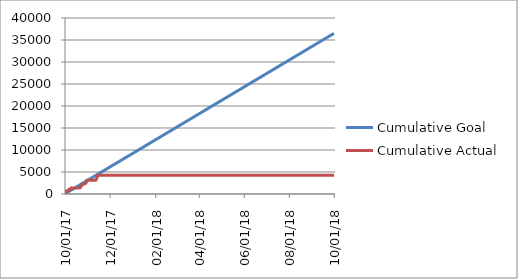
| Category | Cumulative |
|---|---|
| 2017-10-01 | 0 |
| 2017-10-02 | 685 |
| 2017-10-03 | 685 |
| 2017-10-04 | 685 |
| 2017-10-05 | 685 |
| 2017-10-06 | 1061 |
| 2017-10-07 | 1061 |
| 2017-10-08 | 1061 |
| 2017-10-09 | 1392 |
| 2017-10-10 | 1392 |
| 2017-10-11 | 1392 |
| 2017-10-12 | 1392 |
| 2017-10-13 | 1392 |
| 2017-10-14 | 1392 |
| 2017-10-15 | 1392 |
| 2017-10-16 | 1392 |
| 2017-10-17 | 1392 |
| 2017-10-18 | 1392 |
| 2017-10-19 | 1392 |
| 2017-10-20 | 1412 |
| 2017-10-21 | 1412 |
| 2017-10-22 | 1412 |
| 2017-10-23 | 1857 |
| 2017-10-24 | 1857 |
| 2017-10-25 | 2286 |
| 2017-10-26 | 2286 |
| 2017-10-27 | 2286 |
| 2017-10-28 | 2479 |
| 2017-10-29 | 2479 |
| 2017-10-30 | 3119 |
| 2017-10-31 | 3119 |
| 2017-11-01 | 3119 |
| 2017-11-02 | 3119 |
| 2017-11-03 | 3119 |
| 2017-11-04 | 3119 |
| 2017-11-05 | 3119 |
| 2017-11-06 | 3119 |
| 2017-11-07 | 3119 |
| 2017-11-08 | 3119 |
| 2017-11-09 | 3119 |
| 2017-11-10 | 3119 |
| 2017-11-11 | 3119 |
| 2017-11-12 | 3119 |
| 2017-11-13 | 3718 |
| 2017-11-14 | 4267 |
| 2017-11-15 | 4267 |
| 2017-11-16 | 4267 |
| 2017-11-17 | 4267 |
| 2017-11-18 | 4267 |
| 2017-11-19 | 4267 |
| 2017-11-20 | 4267 |
| 2017-11-21 | 4267 |
| 2017-11-22 | 4267 |
| 2017-11-23 | 4267 |
| 2017-11-24 | 4267 |
| 2017-11-25 | 4267 |
| 2017-11-26 | 4267 |
| 2017-11-27 | 4267 |
| 2017-11-28 | 4267 |
| 2017-11-29 | 4267 |
| 2017-11-30 | 4267 |
| 2017-12-01 | 4267 |
| 2017-12-02 | 4267 |
| 2017-12-03 | 4267 |
| 2017-12-04 | 4267 |
| 2017-12-05 | 4267 |
| 2017-12-06 | 4267 |
| 2017-12-07 | 4267 |
| 2017-12-08 | 4267 |
| 2017-12-09 | 4267 |
| 2017-12-10 | 4267 |
| 2017-12-11 | 4267 |
| 2017-12-12 | 4267 |
| 2017-12-13 | 4267 |
| 2017-12-14 | 4267 |
| 2017-12-15 | 4267 |
| 2017-12-16 | 4267 |
| 2017-12-17 | 4267 |
| 2017-12-18 | 4267 |
| 2017-12-19 | 4267 |
| 2017-12-20 | 4267 |
| 2017-12-21 | 4267 |
| 2017-12-22 | 4267 |
| 2017-12-23 | 4267 |
| 2017-12-24 | 4267 |
| 2017-12-25 | 4267 |
| 2017-12-26 | 4267 |
| 2017-12-27 | 4267 |
| 2017-12-28 | 4267 |
| 2017-12-29 | 4267 |
| 2017-12-30 | 4267 |
| 2017-12-31 | 4267 |
| 2018-01-01 | 4267 |
| 2018-01-02 | 4267 |
| 2018-01-03 | 4267 |
| 2018-01-04 | 4267 |
| 2018-01-05 | 4267 |
| 2018-01-06 | 4267 |
| 2018-01-07 | 4267 |
| 2018-01-08 | 4267 |
| 2018-01-09 | 4267 |
| 2018-01-10 | 4267 |
| 2018-01-11 | 4267 |
| 2018-01-12 | 4267 |
| 2018-01-13 | 4267 |
| 2018-01-14 | 4267 |
| 2018-01-15 | 4267 |
| 2018-01-16 | 4267 |
| 2018-01-17 | 4267 |
| 2018-01-18 | 4267 |
| 2018-01-19 | 4267 |
| 2018-01-20 | 4267 |
| 2018-01-21 | 4267 |
| 2018-01-22 | 4267 |
| 2018-01-23 | 4267 |
| 2018-01-24 | 4267 |
| 2018-01-25 | 4267 |
| 2018-01-26 | 4267 |
| 2018-01-27 | 4267 |
| 2018-01-28 | 4267 |
| 2018-01-29 | 4267 |
| 2018-01-30 | 4267 |
| 2018-01-31 | 4267 |
| 2018-02-01 | 4267 |
| 2018-02-02 | 4267 |
| 2018-02-03 | 4267 |
| 2018-02-04 | 4267 |
| 2018-02-05 | 4267 |
| 2018-02-06 | 4267 |
| 2018-02-07 | 4267 |
| 2018-02-08 | 4267 |
| 2018-02-09 | 4267 |
| 2018-02-10 | 4267 |
| 2018-02-11 | 4267 |
| 2018-02-12 | 4267 |
| 2018-02-13 | 4267 |
| 2018-02-14 | 4267 |
| 2018-02-15 | 4267 |
| 2018-02-16 | 4267 |
| 2018-02-17 | 4267 |
| 2018-02-18 | 4267 |
| 2018-02-19 | 4267 |
| 2018-02-20 | 4267 |
| 2018-02-21 | 4267 |
| 2018-02-22 | 4267 |
| 2018-02-23 | 4267 |
| 2018-02-24 | 4267 |
| 2018-02-25 | 4267 |
| 2018-02-26 | 4267 |
| 2018-02-27 | 4267 |
| 2018-02-28 | 4267 |
| 2018-03-01 | 4267 |
| 2018-03-02 | 4267 |
| 2018-03-03 | 4267 |
| 2018-03-04 | 4267 |
| 2018-03-05 | 4267 |
| 2018-03-06 | 4267 |
| 2018-03-07 | 4267 |
| 2018-03-08 | 4267 |
| 2018-03-09 | 4267 |
| 2018-03-10 | 4267 |
| 2018-03-11 | 4267 |
| 2018-03-12 | 4267 |
| 2018-03-13 | 4267 |
| 2018-03-14 | 4267 |
| 2018-03-15 | 4267 |
| 2018-03-16 | 4267 |
| 2018-03-17 | 4267 |
| 2018-03-18 | 4267 |
| 2018-03-19 | 4267 |
| 2018-03-20 | 4267 |
| 2018-03-21 | 4267 |
| 2018-03-22 | 4267 |
| 2018-03-23 | 4267 |
| 2018-03-24 | 4267 |
| 2018-03-25 | 4267 |
| 2018-03-26 | 4267 |
| 2018-03-27 | 4267 |
| 2018-03-28 | 4267 |
| 2018-03-29 | 4267 |
| 2018-03-30 | 4267 |
| 2018-03-31 | 4267 |
| 2018-04-01 | 4267 |
| 2018-04-02 | 4267 |
| 2018-04-03 | 4267 |
| 2018-04-04 | 4267 |
| 2018-04-05 | 4267 |
| 2018-04-06 | 4267 |
| 2018-04-07 | 4267 |
| 2018-04-08 | 4267 |
| 2018-04-09 | 4267 |
| 2018-04-10 | 4267 |
| 2018-04-11 | 4267 |
| 2018-04-12 | 4267 |
| 2018-04-13 | 4267 |
| 2018-04-14 | 4267 |
| 2018-04-15 | 4267 |
| 2018-04-16 | 4267 |
| 2018-04-17 | 4267 |
| 2018-04-18 | 4267 |
| 2018-04-19 | 4267 |
| 2018-04-20 | 4267 |
| 2018-04-21 | 4267 |
| 2018-04-22 | 4267 |
| 2018-04-23 | 4267 |
| 2018-04-24 | 4267 |
| 2018-04-25 | 4267 |
| 2018-04-26 | 4267 |
| 2018-04-27 | 4267 |
| 2018-04-28 | 4267 |
| 2018-04-29 | 4267 |
| 2018-04-30 | 4267 |
| 2018-05-01 | 4267 |
| 2018-05-02 | 4267 |
| 2018-05-03 | 4267 |
| 2018-05-04 | 4267 |
| 2018-05-05 | 4267 |
| 2018-05-06 | 4267 |
| 2018-05-07 | 4267 |
| 2018-05-08 | 4267 |
| 2018-05-09 | 4267 |
| 2018-05-10 | 4267 |
| 2018-05-11 | 4267 |
| 2018-05-12 | 4267 |
| 2018-05-13 | 4267 |
| 2018-05-14 | 4267 |
| 2018-05-15 | 4267 |
| 2018-05-16 | 4267 |
| 2018-05-17 | 4267 |
| 2018-05-18 | 4267 |
| 2018-05-19 | 4267 |
| 2018-05-20 | 4267 |
| 2018-05-21 | 4267 |
| 2018-05-22 | 4267 |
| 2018-05-23 | 4267 |
| 2018-05-24 | 4267 |
| 2018-05-25 | 4267 |
| 2018-05-26 | 4267 |
| 2018-05-27 | 4267 |
| 2018-05-28 | 4267 |
| 2018-05-29 | 4267 |
| 2018-05-30 | 4267 |
| 2018-05-31 | 4267 |
| 2018-06-01 | 4267 |
| 2018-06-02 | 4267 |
| 2018-06-03 | 4267 |
| 2018-06-04 | 4267 |
| 2018-06-05 | 4267 |
| 2018-06-06 | 4267 |
| 2018-06-07 | 4267 |
| 2018-06-08 | 4267 |
| 2018-06-09 | 4267 |
| 2018-06-10 | 4267 |
| 2018-06-11 | 4267 |
| 2018-06-12 | 4267 |
| 2018-06-13 | 4267 |
| 2018-06-14 | 4267 |
| 2018-06-15 | 4267 |
| 2018-06-16 | 4267 |
| 2018-06-17 | 4267 |
| 2018-06-18 | 4267 |
| 2018-06-19 | 4267 |
| 2018-06-20 | 4267 |
| 2018-06-21 | 4267 |
| 2018-06-22 | 4267 |
| 2018-06-23 | 4267 |
| 2018-06-24 | 4267 |
| 2018-06-25 | 4267 |
| 2018-06-26 | 4267 |
| 2018-06-27 | 4267 |
| 2018-06-28 | 4267 |
| 2018-06-29 | 4267 |
| 2018-06-30 | 4267 |
| 2018-07-01 | 4267 |
| 2018-07-02 | 4267 |
| 2018-07-03 | 4267 |
| 2018-07-04 | 4267 |
| 2018-07-05 | 4267 |
| 2018-07-06 | 4267 |
| 2018-07-07 | 4267 |
| 2018-07-08 | 4267 |
| 2018-07-09 | 4267 |
| 2018-07-10 | 4267 |
| 2018-07-11 | 4267 |
| 2018-07-12 | 4267 |
| 2018-07-13 | 4267 |
| 2018-07-14 | 4267 |
| 2018-07-15 | 4267 |
| 2018-07-16 | 4267 |
| 2018-07-17 | 4267 |
| 2018-07-18 | 4267 |
| 2018-07-19 | 4267 |
| 2018-07-20 | 4267 |
| 2018-07-21 | 4267 |
| 2018-07-22 | 4267 |
| 2018-07-23 | 4267 |
| 2018-07-24 | 4267 |
| 2018-07-25 | 4267 |
| 2018-07-26 | 4267 |
| 2018-07-27 | 4267 |
| 2018-07-28 | 4267 |
| 2018-07-29 | 4267 |
| 2018-07-30 | 4267 |
| 2018-07-31 | 4267 |
| 2018-08-01 | 4267 |
| 2018-08-02 | 4267 |
| 2018-08-03 | 4267 |
| 2018-08-04 | 4267 |
| 2018-08-05 | 4267 |
| 2018-08-06 | 4267 |
| 2018-08-07 | 4267 |
| 2018-08-08 | 4267 |
| 2018-08-09 | 4267 |
| 2018-08-10 | 4267 |
| 2018-08-11 | 4267 |
| 2018-08-12 | 4267 |
| 2018-08-13 | 4267 |
| 2018-08-14 | 4267 |
| 2018-08-15 | 4267 |
| 2018-08-16 | 4267 |
| 2018-08-17 | 4267 |
| 2018-08-18 | 4267 |
| 2018-08-19 | 4267 |
| 2018-08-20 | 4267 |
| 2018-08-21 | 4267 |
| 2018-08-22 | 4267 |
| 2018-08-23 | 4267 |
| 2018-08-24 | 4267 |
| 2018-08-25 | 4267 |
| 2018-08-26 | 4267 |
| 2018-08-27 | 4267 |
| 2018-08-28 | 4267 |
| 2018-08-29 | 4267 |
| 2018-08-30 | 4267 |
| 2018-08-31 | 4267 |
| 2018-09-01 | 4267 |
| 2018-09-02 | 4267 |
| 2018-09-03 | 4267 |
| 2018-09-04 | 4267 |
| 2018-09-05 | 4267 |
| 2018-09-06 | 4267 |
| 2018-09-07 | 4267 |
| 2018-09-08 | 4267 |
| 2018-09-09 | 4267 |
| 2018-09-10 | 4267 |
| 2018-09-11 | 4267 |
| 2018-09-12 | 4267 |
| 2018-09-13 | 4267 |
| 2018-09-14 | 4267 |
| 2018-09-15 | 4267 |
| 2018-09-16 | 4267 |
| 2018-09-17 | 4267 |
| 2018-09-18 | 4267 |
| 2018-09-19 | 4267 |
| 2018-09-20 | 4267 |
| 2018-09-21 | 4267 |
| 2018-09-22 | 4267 |
| 2018-09-23 | 4267 |
| 2018-09-24 | 4267 |
| 2018-09-25 | 4267 |
| 2018-09-26 | 4267 |
| 2018-09-27 | 4267 |
| 2018-09-28 | 4267 |
| 2018-09-29 | 4267 |
| 2018-09-30 | 4267 |
| 2018-10-01 | 4267 |